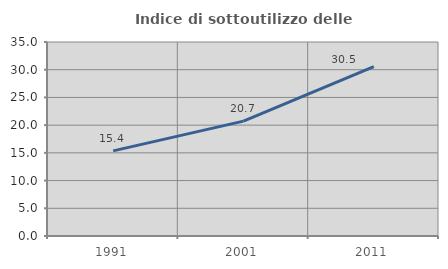
| Category | Indice di sottoutilizzo delle abitazioni  |
|---|---|
| 1991.0 | 15.364 |
| 2001.0 | 20.727 |
| 2011.0 | 30.549 |